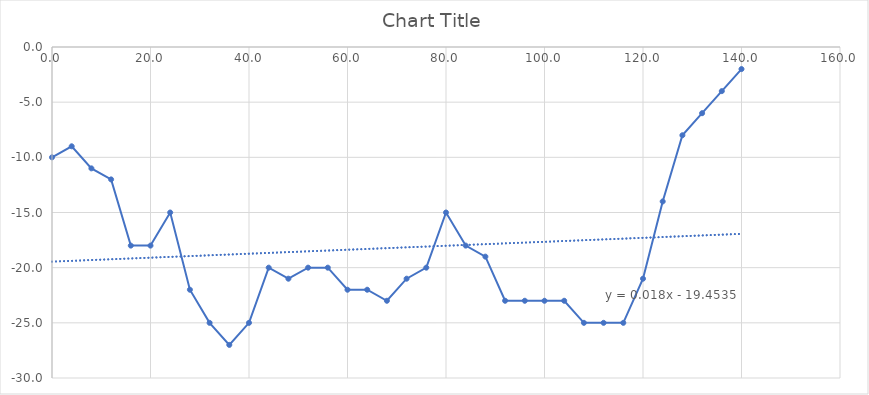
| Category | Series 0 |
|---|---|
| 0.0 | -10 |
| 4.0 | -9 |
| 8.0 | -11 |
| 12.0 | -12 |
| 16.0 | -18 |
| 20.0 | -18 |
| 24.0 | -15 |
| 28.0 | -22 |
| 32.0 | -25 |
| 36.0 | -27 |
| 40.0 | -25 |
| 44.0 | -20 |
| 48.0 | -21 |
| 52.0 | -20 |
| 56.0 | -20 |
| 60.0 | -22 |
| 64.0 | -22 |
| 68.0 | -23 |
| 72.0 | -21 |
| 76.0 | -20 |
| 80.0 | -15 |
| 84.0 | -18 |
| 88.0 | -19 |
| 92.0 | -23 |
| 96.0 | -23 |
| 100.0 | -23 |
| 104.0 | -23 |
| 108.0 | -25 |
| 112.0 | -25 |
| 116.0 | -25 |
| 120.0 | -21 |
| 124.0 | -14 |
| 128.0 | -8 |
| 132.0 | -6 |
| 136.0 | -4 |
| 140.0 | -2 |